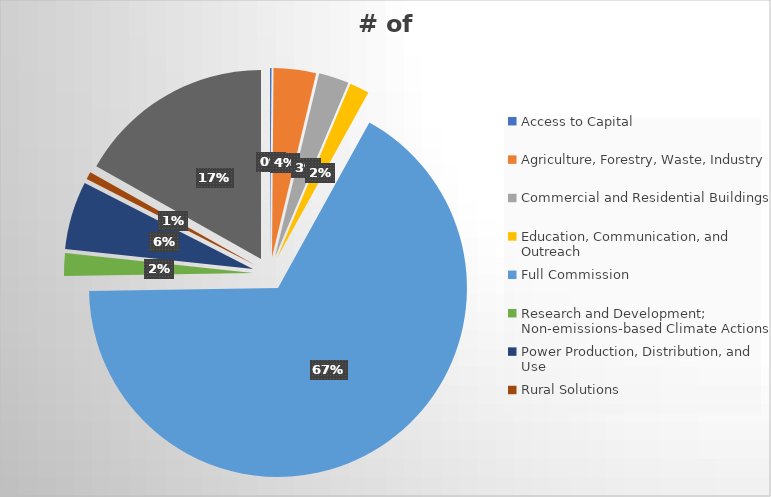
| Category | # of Supporters |
|---|---|
| Access to Capital | 1 |
| Agriculture, Forestry, Waste, Industry | 28 |
| Commercial and Residential Buildings | 20 |
| Education, Communication, and Outreach | 13 |
| Full Commission | 515 |
| Research and Development; Non-emissions-based Climate Actions | 15 |
| Power Production, Distribution, and Use | 45 |
| Rural Solutions | 5 |
| Transportation | 130 |